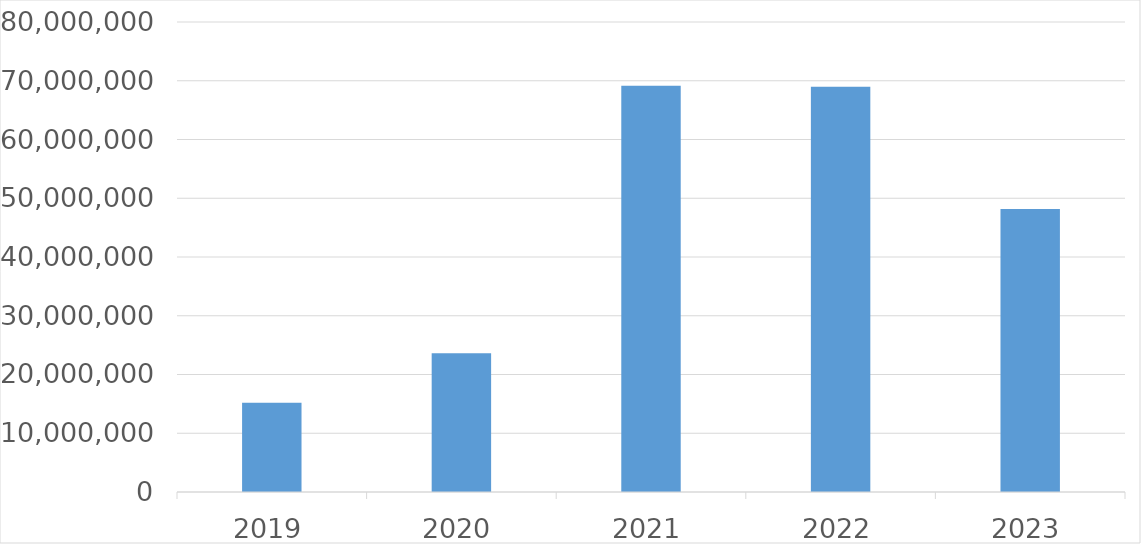
| Category | Series 0 |
|---|---|
| 2019 | 15191931 |
| 2020 | 23611590 |
| 2021 | 69150172 |
| 2022 | 68966196 |
| 2023 | 48153672 |